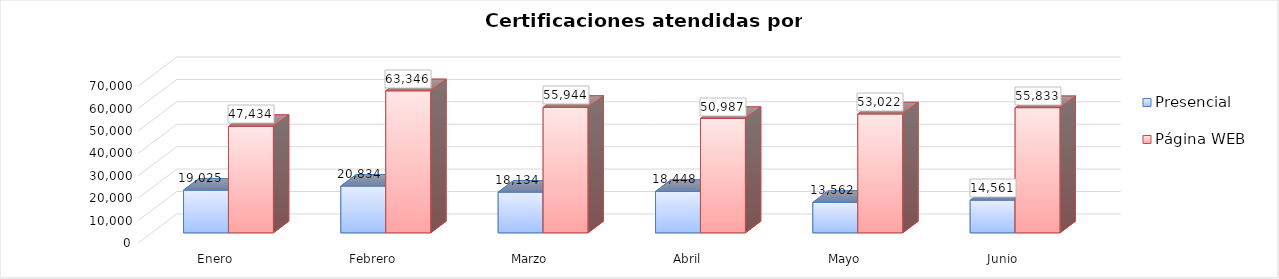
| Category | Presencial | Página WEB |
|---|---|---|
| Enero | 19025 | 47434 |
| Febrero | 20834 | 63346 |
| Marzo | 18134 | 55944 |
| Abril | 18448 | 50987 |
| Mayo | 13562 | 53022 |
| Junio | 14561 | 55833 |